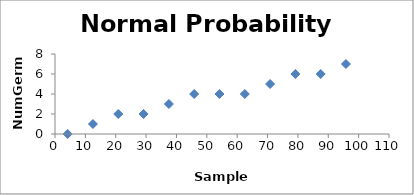
| Category | Series 0 |
|---|---|
| 4.166666666666667 | 0 |
| 12.5 | 1 |
| 20.833333333333336 | 2 |
| 29.166666666666668 | 2 |
| 37.5 | 3 |
| 45.833333333333336 | 4 |
| 54.166666666666664 | 4 |
| 62.5 | 4 |
| 70.83333333333334 | 5 |
| 79.16666666666667 | 6 |
| 87.50000000000001 | 6 |
| 95.83333333333334 | 7 |